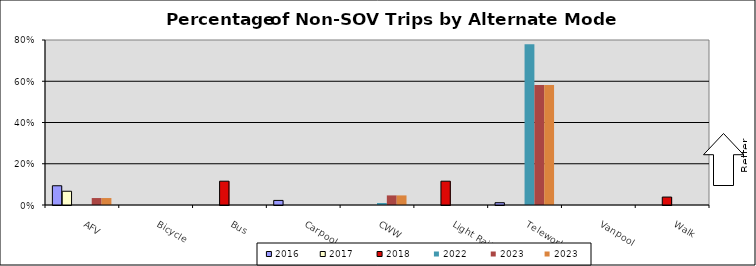
| Category | 2016 | 2017 | 2018 | 2022 | 2023 |
|---|---|---|---|---|---|
| AFV | 0.093 | 0.067 | 0 | 0 | 0.034 |
| Bicycle | 0 | 0 | 0 | 0 | 0 |
| Bus | 0 | 0 | 0.115 | 0 | 0 |
| Carpool | 0.022 | 0 | 0 | 0 | 0 |
| CWW | 0 | 0 | 0 | 0.01 | 0.047 |
| Light Rail | 0 | 0 | 0.115 | 0 | 0 |
| Telework | 0.011 | 0 | 0 | 0.779 | 0.581 |
| Vanpool | 0 | 0 | 0 | 0 | 0 |
| Walk | 0 | 0 | 0.038 | 0 | 0 |